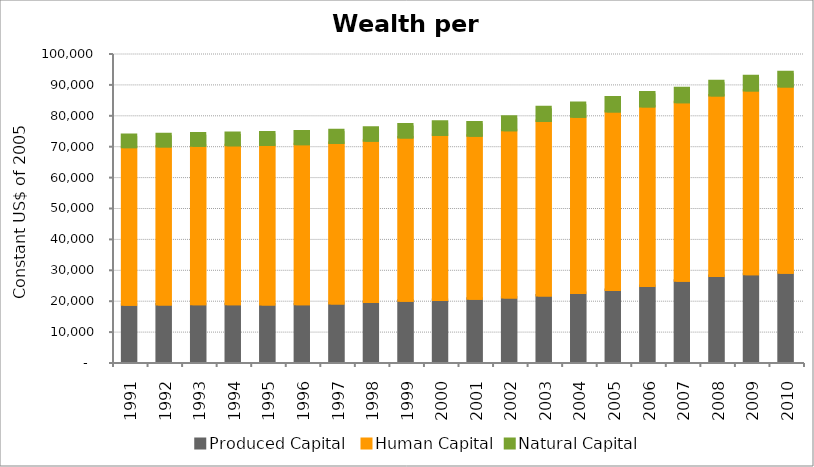
| Category | Produced Capital  | Human Capital | Natural Capital |
|---|---|---|---|
| 1991.0 | 18515.874 | 51016.185 | 3902.844 |
| 1992.0 | 18640.915 | 51131.055 | 3927.813 |
| 1993.0 | 18673.19 | 51274.525 | 3960.679 |
| 1994.0 | 18664.037 | 51444.687 | 3998.244 |
| 1995.0 | 18606.72 | 51639.713 | 4038.476 |
| 1996.0 | 18686.375 | 51798.995 | 4081.294 |
| 1997.0 | 18958.521 | 51953.499 | 4126.301 |
| 1998.0 | 19419.73 | 52206.76 | 4171.352 |
| 1999.0 | 19803.809 | 52843.285 | 4216.197 |
| 2000.0 | 20075.479 | 53411.873 | 4257.895 |
| 2001.0 | 20450.05 | 52779.079 | 4307.067 |
| 2002.0 | 20913.931 | 54074.656 | 4353.303 |
| 2003.0 | 21516.062 | 56504.758 | 4398.215 |
| 2004.0 | 22315.558 | 57018.444 | 4444.421 |
| 2005.0 | 23278.091 | 57811.333 | 4493.779 |
| 2006.0 | 24566.363 | 58153.804 | 4515.884 |
| 2007.0 | 26289.782 | 57768.24 | 4539.768 |
| 2008.0 | 27838.393 | 58435.128 | 4563.872 |
| 2009.0 | 28367.692 | 59530.986 | 4587.725 |
| 2010.0 | 28892.343 | 60285.247 | 4610.088 |